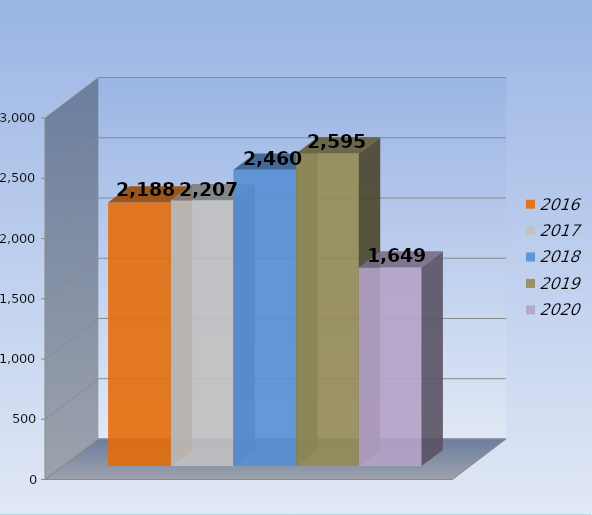
| Category | 2016 | 2017 | 2018 | 2019 | 2020 |
|---|---|---|---|---|---|
| 0 | 2188 | 2207 | 2460 | 2595 | 1649 |